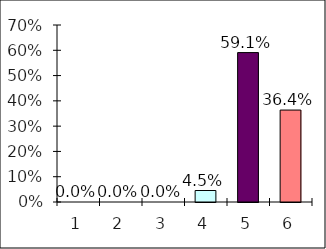
| Category | Series 0 |
|---|---|
| 0 | 0 |
| 1 | 0 |
| 2 | 0 |
| 3 | 0.045 |
| 4 | 0.591 |
| 5 | 0.364 |